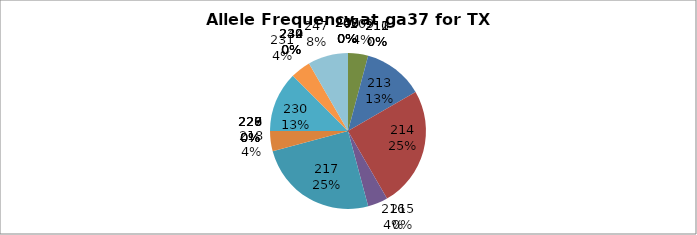
| Category | Series 0 |
|---|---|
| 207.0 | 0 |
| 208.0 | 0 |
| 209.0 | 0.042 |
| 210.0 | 0 |
| 211.0 | 0 |
| 212.0 | 0 |
| 213.0 | 0.125 |
| 214.0 | 0.25 |
| 215.0 | 0 |
| 216.0 | 0.042 |
| 217.0 | 0.25 |
| 218.0 | 0.042 |
| 226.0 | 0 |
| 227.0 | 0 |
| 228.0 | 0 |
| 229.0 | 0 |
| 230.0 | 0.125 |
| 231.0 | 0.042 |
| 232.0 | 0 |
| 234.0 | 0 |
| 239.0 | 0 |
| 240.0 | 0 |
| 247.0 | 0.083 |
| 248.0 | 0 |
| 249.0 | 0 |
| 250.0 | 0 |